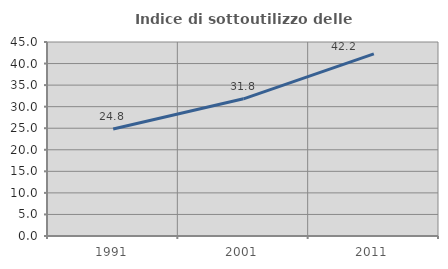
| Category | Indice di sottoutilizzo delle abitazioni  |
|---|---|
| 1991.0 | 24.812 |
| 2001.0 | 31.824 |
| 2011.0 | 42.231 |